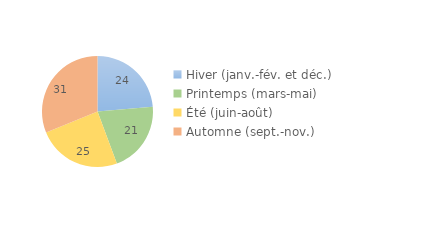
| Category | Series 0 |
|---|---|
| Hiver (janv.-fév. et déc.) | 23.616 |
| Printemps (mars-mai) | 20.709 |
| Été (juin-août) | 24.538 |
| Automne (sept.-nov.) | 31.137 |